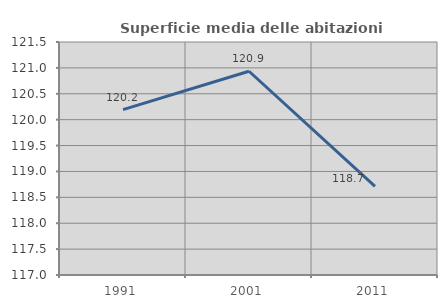
| Category | Superficie media delle abitazioni occupate |
|---|---|
| 1991.0 | 120.193 |
| 2001.0 | 120.935 |
| 2011.0 | 118.71 |